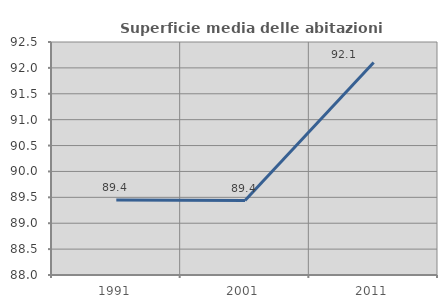
| Category | Superficie media delle abitazioni occupate |
|---|---|
| 1991.0 | 89.45 |
| 2001.0 | 89.438 |
| 2011.0 | 92.103 |